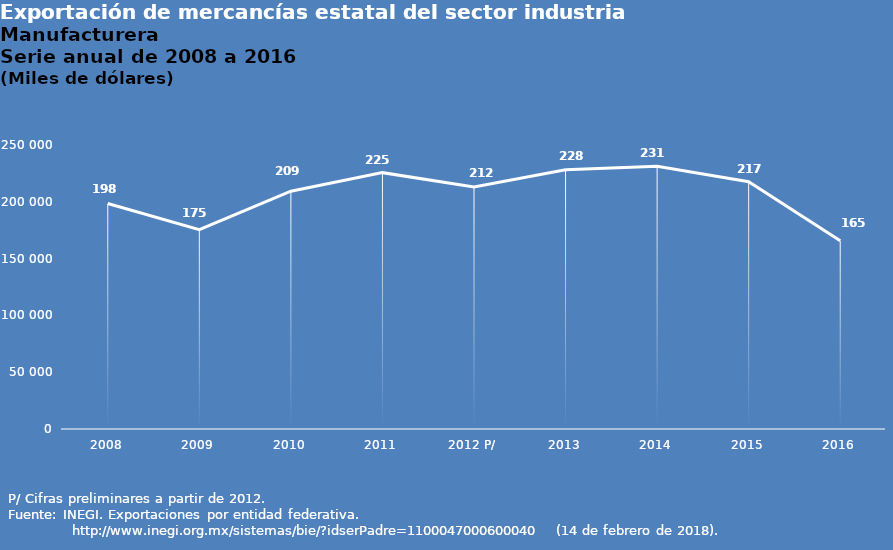
| Category | Series 0 |
|---|---|
| 2008 | 198486 |
| 2009 | 175478 |
| 2010 | 209341 |
| 2011 | 225662 |
| 2012 P/ | 212958 |
| 2013 | 228182 |
| 2014 | 231220 |
| 2015 | 217736 |
| 2016 | 165732 |